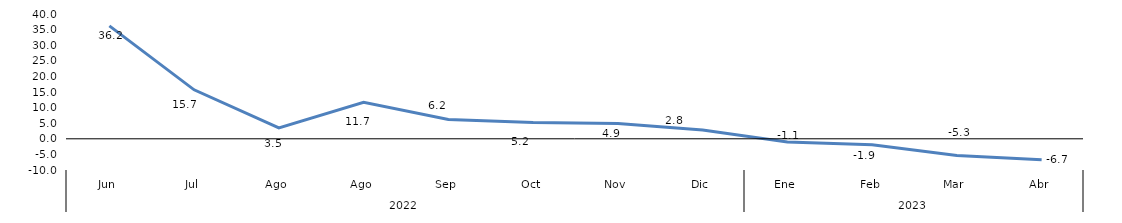
| Category | Series 0 |
|---|---|
| 0 | 36.206 |
| 1 | 15.697 |
| 2 | 3.507 |
| 3 | 11.673 |
| 4 | 6.208 |
| 5 | 5.211 |
| 6 | 4.925 |
| 7 | 2.822 |
| 8 | -1.059 |
| 9 | -1.926 |
| 10 | -5.346 |
| 11 | -6.689 |